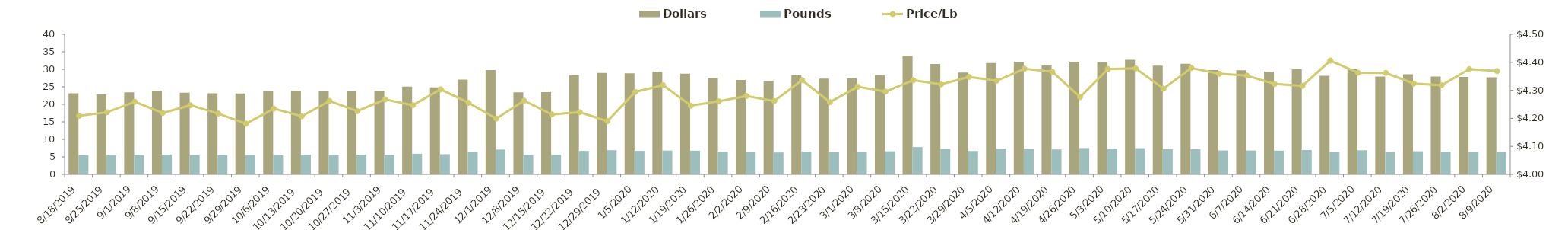
| Category | Dollars | Pounds |
|---|---|---|
| 8/18/19 | 23156672.44 | 5501507.62 |
| 8/25/19 | 22886660.44 | 5421030.49 |
| 9/1/19 | 23445293.38 | 5504897 |
| 9/8/19 | 23878127.05 | 5659625.24 |
| 9/15/19 | 23326883.63 | 5492827.12 |
| 9/22/19 | 23173685.66 | 5495157.27 |
| 9/29/19 | 23103341.45 | 5525473.21 |
| 10/6/19 | 23753257.43 | 5609031.74 |
| 10/13/19 | 23835866.9 | 5665331.67 |
| 10/20/19 | 23671003.78 | 5553848.11 |
| 10/27/19 | 23768552.87 | 5624513.67 |
| 11/3/19 | 23779626.37 | 5572166.37 |
| 11/10/19 | 25028255.89 | 5893314.59 |
| 11/17/19 | 24844562.8 | 5773126.9 |
| 11/24/19 | 27076885.42 | 6362688.2 |
| 12/1/19 | 29776395.15 | 7091010.14 |
| 12/8/19 | 23405820.03 | 5490594.46 |
| 12/15/19 | 23498166.56 | 5576169.17 |
| 12/22/19 | 28340213.39 | 6712416.05 |
| 12/29/19 | 28969024.83 | 6913324.3 |
| 1/5/20 | 28866672.58 | 6722212.18 |
| 1/12/20 | 29354311.8 | 6797539.36 |
| 1/19/20 | 28764000.76 | 6775627.84 |
| 1/26/20 | 27552218.97 | 6466591.48 |
| 2/2/20 | 26968285.47 | 6300874.54 |
| 2/9/20 | 26688382.53 | 6262030.52 |
| 2/16/20 | 28347509.37 | 6537220 |
| 2/23/20 | 27319190.65 | 6416240.53 |
| 3/1/20 | 27398348.52 | 6352587 |
| 3/8/20 | 28334390.39 | 6596387.85 |
| 3/15/20 | 33806032.79 | 7796300.53 |
| 3/22/20 | 31500549.24 | 7289226.29 |
| 3/29/20 | 29095323.71 | 6691897.18 |
| 4/5/20 | 31801211.92 | 7337566.72 |
| 4/12/20 | 32098357.2 | 7333507.09 |
| 4/19/20 | 31097811.77 | 7122064.06 |
| 4/26/20 | 32154605.88 | 7519837.89 |
| 5/3/20 | 32075055.21 | 7329743.39 |
| 5/10/20 | 32733296.15 | 7476543.13 |
| 5/17/20 | 31050766.13 | 7211310.44 |
| 5/24/20 | 31589052.48 | 7212679.99 |
| 5/31/20 | 29784995.9 | 6832858.41 |
| 6/7/20 | 29705997.37 | 6825065.79 |
| 6/14/20 | 29343586.32 | 6788560.72 |
| 6/21/20 | 30038491.77 | 6959885.96 |
| 6/28/20 | 28147226.2 | 6388136.48 |
| 7/5/20 | 30046107.06 | 6886986.96 |
| 7/12/20 | 27917984.82 | 6400195.17 |
| 7/19/20 | 28599396.63 | 6614112.43 |
| 7/26/20 | 27919308.65 | 6465645.48 |
| 8/2/20 | 27846593.09 | 6364171.49 |
| 8/9/20 | 27736694.36 | 6349069.53 |